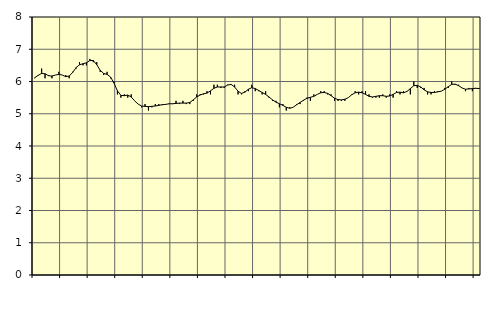
| Category | Piggar | Transport, SNI 49-53 |
|---|---|---|
| nan | 6.1 | 6.12 |
| 87.0 | 6.2 | 6.19 |
| 87.0 | 6.4 | 6.25 |
| 87.0 | 6.1 | 6.24 |
| nan | 6.2 | 6.18 |
| 88.0 | 6.1 | 6.17 |
| 88.0 | 6.2 | 6.2 |
| 88.0 | 6.3 | 6.22 |
| nan | 6.2 | 6.2 |
| 89.0 | 6.2 | 6.15 |
| 89.0 | 6.1 | 6.17 |
| 89.0 | 6.3 | 6.28 |
| nan | 6.4 | 6.43 |
| 90.0 | 6.6 | 6.52 |
| 90.0 | 6.5 | 6.55 |
| 90.0 | 6.5 | 6.58 |
| nan | 6.7 | 6.65 |
| 91.0 | 6.6 | 6.65 |
| 91.0 | 6.6 | 6.52 |
| 91.0 | 6.3 | 6.35 |
| nan | 6.2 | 6.25 |
| 92.0 | 6.3 | 6.22 |
| 92.0 | 6.1 | 6.14 |
| 92.0 | 6 | 5.95 |
| nan | 5.6 | 5.71 |
| 93.0 | 5.5 | 5.57 |
| 93.0 | 5.6 | 5.56 |
| 93.0 | 5.5 | 5.58 |
| nan | 5.6 | 5.52 |
| 94.0 | 5.4 | 5.4 |
| 94.0 | 5.3 | 5.3 |
| 94.0 | 5.2 | 5.24 |
| nan | 5.3 | 5.23 |
| 95.0 | 5.1 | 5.22 |
| 95.0 | 5.2 | 5.23 |
| 95.0 | 5.3 | 5.24 |
| nan | 5.3 | 5.26 |
| 96.0 | 5.3 | 5.28 |
| 96.0 | 5.3 | 5.29 |
| 96.0 | 5.3 | 5.31 |
| nan | 5.3 | 5.31 |
| 97.0 | 5.4 | 5.32 |
| 97.0 | 5.3 | 5.33 |
| 97.0 | 5.4 | 5.33 |
| nan | 5.3 | 5.33 |
| 98.0 | 5.3 | 5.35 |
| 98.0 | 5.4 | 5.43 |
| 98.0 | 5.6 | 5.52 |
| nan | 5.6 | 5.58 |
| 99.0 | 5.6 | 5.62 |
| 99.0 | 5.7 | 5.64 |
| 99.0 | 5.6 | 5.71 |
| nan | 5.9 | 5.79 |
| 0.0 | 5.9 | 5.83 |
| 0.0 | 5.8 | 5.83 |
| 0.0 | 5.8 | 5.83 |
| nan | 5.9 | 5.89 |
| 1.0 | 5.9 | 5.91 |
| 1.0 | 5.9 | 5.83 |
| 1.0 | 5.6 | 5.7 |
| nan | 5.6 | 5.63 |
| 2.0 | 5.7 | 5.67 |
| 2.0 | 5.7 | 5.76 |
| 2.0 | 5.9 | 5.81 |
| nan | 5.7 | 5.78 |
| 3.0 | 5.7 | 5.72 |
| 3.0 | 5.6 | 5.66 |
| 3.0 | 5.7 | 5.6 |
| nan | 5.5 | 5.52 |
| 4.0 | 5.4 | 5.43 |
| 4.0 | 5.4 | 5.36 |
| 4.0 | 5.2 | 5.31 |
| nan | 5.3 | 5.26 |
| 5.0 | 5.1 | 5.2 |
| 5.0 | 5.2 | 5.17 |
| 5.0 | 5.2 | 5.2 |
| nan | 5.3 | 5.28 |
| 6.0 | 5.3 | 5.35 |
| 6.0 | 5.4 | 5.42 |
| 6.0 | 5.5 | 5.48 |
| nan | 5.4 | 5.51 |
| 7.0 | 5.6 | 5.54 |
| 7.0 | 5.6 | 5.6 |
| 7.0 | 5.7 | 5.65 |
| nan | 5.7 | 5.66 |
| 8.0 | 5.6 | 5.63 |
| 8.0 | 5.6 | 5.56 |
| 8.0 | 5.4 | 5.48 |
| nan | 5.4 | 5.44 |
| 9.0 | 5.4 | 5.43 |
| 9.0 | 5.4 | 5.45 |
| 9.0 | 5.5 | 5.5 |
| nan | 5.6 | 5.59 |
| 10.0 | 5.7 | 5.65 |
| 10.0 | 5.6 | 5.67 |
| 10.0 | 5.7 | 5.65 |
| nan | 5.7 | 5.6 |
| 11.0 | 5.6 | 5.54 |
| 11.0 | 5.5 | 5.52 |
| 11.0 | 5.5 | 5.54 |
| nan | 5.5 | 5.56 |
| 12.0 | 5.6 | 5.56 |
| 12.0 | 5.5 | 5.54 |
| 12.0 | 5.6 | 5.55 |
| nan | 5.5 | 5.6 |
| 13.0 | 5.7 | 5.66 |
| 13.0 | 5.6 | 5.67 |
| 13.0 | 5.7 | 5.65 |
| nan | 5.7 | 5.69 |
| 14.0 | 5.6 | 5.78 |
| 14.0 | 6 | 5.87 |
| 14.0 | 5.8 | 5.88 |
| nan | 5.8 | 5.83 |
| 15.0 | 5.8 | 5.74 |
| 15.0 | 5.6 | 5.68 |
| 15.0 | 5.6 | 5.66 |
| nan | 5.7 | 5.66 |
| 16.0 | 5.7 | 5.68 |
| 16.0 | 5.7 | 5.7 |
| 16.0 | 5.8 | 5.76 |
| nan | 5.8 | 5.84 |
| 17.0 | 6 | 5.91 |
| 17.0 | 5.9 | 5.92 |
| 17.0 | 5.9 | 5.87 |
| nan | 5.8 | 5.8 |
| 18.0 | 5.7 | 5.76 |
| 18.0 | 5.8 | 5.77 |
| 18.0 | 5.7 | 5.78 |
| nan | 5.8 | 5.79 |
| 19.0 | 5.8 | 5.78 |